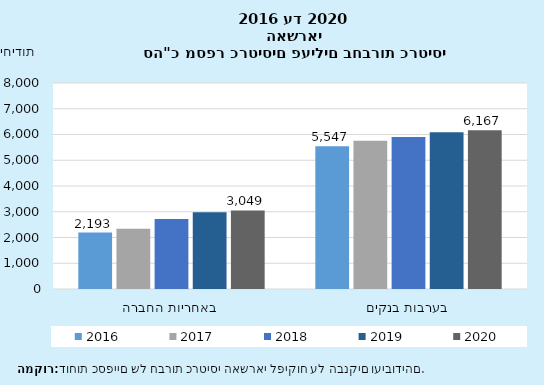
| Category | 2016 | 2017 | 2018 | 2019 | 2020 |
|---|---|---|---|---|---|
| באחריות החברה | 2193 | 2342 | 2716 | 2976 | 3049 |
| בערבות בנקים | 5547 | 5753 | 5902 | 6087 | 6167 |